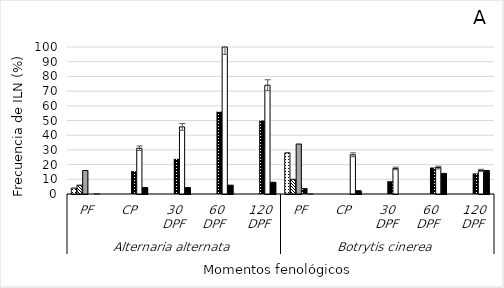
| Category | PÉTALOS  | ESTAMBRES | SÉPALOS | BASE DE CÁLIZ | RESTOS FLORALES | PEDÚNCULO |
|---|---|---|---|---|---|---|
| 0 | 4 | 6 | 16 | 0 | 0 | 0 |
| 1 | 0 | 0 | 0 | 15.55 | 31.11 | 4.44 |
| 2 | 0 | 0 | 0 | 23.91 | 45.65 | 4.34 |
| 3 | 0 | 0 | 0 | 56 | 100 | 6 |
| 4 | 0 | 0 | 0 | 50 | 74 | 8 |
| 5 | 28 | 10 | 34 | 4 | 0 | 0 |
| 6 | 0 | 0 | 0 | 0 | 26.66 | 2.22 |
| 7 | 0 | 0 | 0 | 8.69 | 17.39 | 0 |
| 8 | 0 | 0 | 0 | 18 | 18 | 14 |
| 9 | 0 | 0 | 0 | 14 | 16 | 16 |